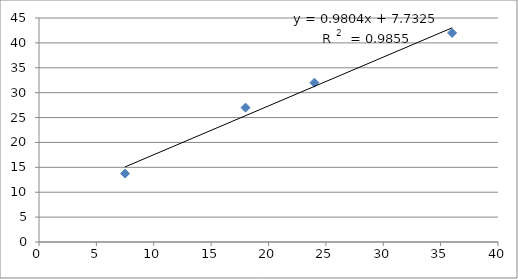
| Category | Series 0 |
|---|---|
| 7.5 | 13.75 |
| 18.0 | 27 |
| 24.0 | 32 |
| 36.0 | 42 |